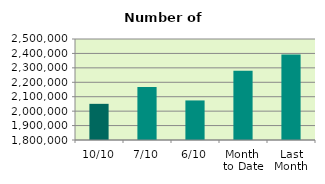
| Category | Series 0 |
|---|---|
| 10/10 | 2050612 |
| 7/10 | 2167936 |
| 6/10 | 2074178 |
| Month 
to Date | 2279529 |
| Last
Month | 2392468.182 |